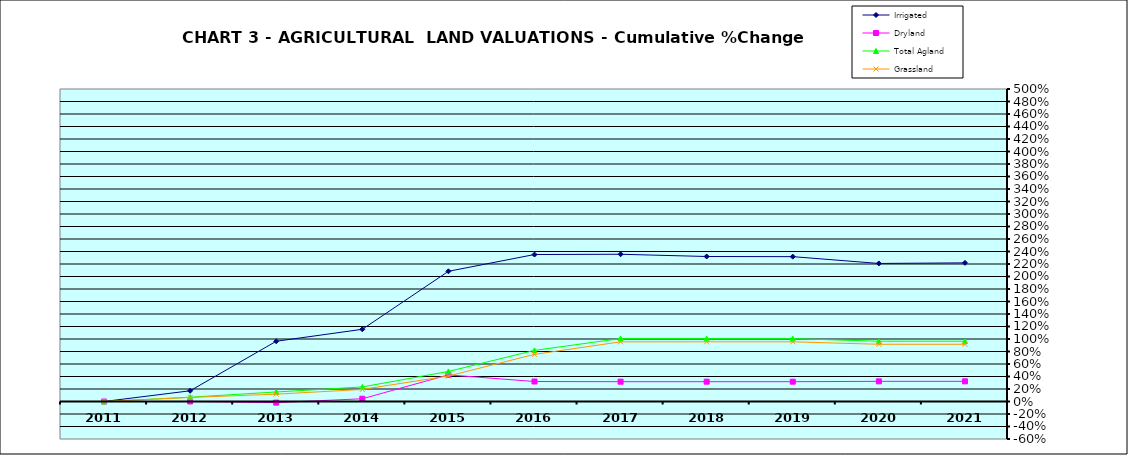
| Category | Irrigated | Dryland | Total Agland | Grassland |
|---|---|---|---|---|
| 2011.0 | 0 | 0 | 0 | 0 |
| 2012.0 | 0.171 | 0.001 | 0.069 | 0.065 |
| 2013.0 | 0.964 | -0.018 | 0.152 | 0.117 |
| 2014.0 | 1.155 | 0.044 | 0.233 | 0.193 |
| 2015.0 | 2.083 | 0.426 | 0.481 | 0.408 |
| 2016.0 | 2.352 | 0.32 | 0.818 | 0.754 |
| 2017.0 | 2.356 | 0.317 | 1.007 | 0.955 |
| 2018.0 | 2.32 | 0.317 | 1.006 | 0.955 |
| 2019.0 | 2.318 | 0.317 | 1.006 | 0.955 |
| 2020.0 | 2.209 | 0.322 | 0.964 | 0.915 |
| 2021.0 | 2.218 | 0.322 | 0.965 | 0.915 |